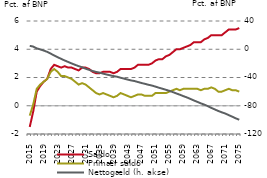
| Category | nul-linje | Saldo  | Primær saldo |
|---|---|---|---|
| 2015.0 | 0 | -1.5 | -0.7 |
| 2016.0 | 0 | -0.4 | 0.1 |
| 2017.0 | 0 | 1 | 1.2 |
| 2018.0 | 0 | 1.4 | 1.5 |
| 2019.0 | 0 | 1.7 | 1.7 |
| 2020.0 | 0 | 1.9 | 1.9 |
| 2021.0 | 0 | 2.6 | 2.4 |
| 2022.0 | 0 | 2.9 | 2.6 |
| 2023.0 | 0 | 2.8 | 2.4 |
| 2024.0 | 0 | 2.7 | 2.1 |
| 2025.0 | 0 | 2.8 | 2.1 |
| 2026.0 | 0 | 2.7 | 2 |
| 2027.0 | 0 | 2.7 | 1.9 |
| 2028.0 | 0 | 2.6 | 1.7 |
| 2029.0 | 0 | 2.5 | 1.5 |
| 2030.0 | 0 | 2.7 | 1.6 |
| 2031.0 | 0 | 2.7 | 1.5 |
| 2032.0 | 0 | 2.6 | 1.3 |
| 2033.0 | 0 | 2.4 | 1.1 |
| 2034.0 | 0 | 2.3 | 0.9 |
| 2035.0 | 0 | 2.3 | 0.8 |
| 2036.0 | 0 | 2.4 | 0.9 |
| 2037.0 | 0 | 2.4 | 0.8 |
| 2038.0 | 0 | 2.4 | 0.7 |
| 2039.0 | 0 | 2.3 | 0.6 |
| 2040.0 | 0 | 2.4 | 0.7 |
| 2041.0 | 0 | 2.6 | 0.9 |
| 2042.0 | 0 | 2.6 | 0.8 |
| 2043.0 | 0 | 2.6 | 0.7 |
| 2044.0 | 0 | 2.6 | 0.6 |
| 2045.0 | 0 | 2.7 | 0.7 |
| 2046.0 | 0 | 2.9 | 0.8 |
| 2047.0 | 0 | 2.9 | 0.8 |
| 2048.0 | 0 | 2.9 | 0.7 |
| 2049.0 | 0 | 2.9 | 0.7 |
| 2050.0 | 0 | 3 | 0.7 |
| 2051.0 | 0 | 3.2 | 0.9 |
| 2052.0 | 0 | 3.3 | 0.9 |
| 2053.0 | 0 | 3.3 | 0.9 |
| 2054.0 | 0 | 3.5 | 0.9 |
| 2055.0 | 0 | 3.6 | 1 |
| 2056.0 | 0 | 3.8 | 1.1 |
| 2057.0 | 0 | 4 | 1.2 |
| 2058.0 | 0 | 4 | 1.1 |
| 2059.0 | 0 | 4.1 | 1.2 |
| 2060.0 | 0 | 4.2 | 1.2 |
| 2061.0 | 0 | 4.3 | 1.2 |
| 2062.0 | 0 | 4.5 | 1.2 |
| 2063.0 | 0 | 4.5 | 1.2 |
| 2064.0 | 0 | 4.5 | 1.1 |
| 2065.0 | 0 | 4.7 | 1.2 |
| 2066.0 | 0 | 4.8 | 1.2 |
| 2067.0 | 0 | 5 | 1.3 |
| 2068.0 | 0 | 5 | 1.2 |
| 2069.0 | 0 | 5 | 1 |
| 2070.0 | 0 | 5 | 1 |
| 2071.0 | 0 | 5.2 | 1.1 |
| 2072.0 | 0 | 5.4 | 1.2 |
| 2073.0 | 0 | 5.4 | 1.1 |
| 2074.0 | 0 | 5.4 | 1.1 |
| 2075.0 | 0 | 5.5 | 1 |